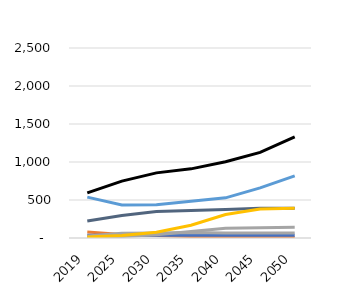
| Category | liquids | natural gas | coal | nuclear | hydro | other | wind | solar |
|---|---|---|---|---|---|---|---|---|
| 2019.0 | 77.92 | 538.19 | 593.2 | 37.21 | 224.79 | 26.84 | 9.54 | 11.95 |
| 2025.0 | 47.72 | 435.38 | 748.69 | 37.27 | 296.98 | 61.18 | 19.72 | 33.01 |
| 2030.0 | 31.63 | 438.36 | 856.97 | 37.27 | 348.86 | 65.65 | 42.28 | 75.33 |
| 2035.0 | 20.73 | 483.49 | 909.77 | 37.27 | 363.12 | 71 | 86.82 | 168.24 |
| 2040.0 | 13.36 | 528.4 | 1003.66 | 37.27 | 373.41 | 65.88 | 129.52 | 308.23 |
| 2045.0 | 8.36 | 658.91 | 1125.82 | 37.27 | 391.83 | 65.99 | 134.92 | 381.82 |
| 2050.0 | 5.22 | 817.75 | 1329.06 | 37.27 | 391.9 | 66.1 | 140.77 | 390.06 |